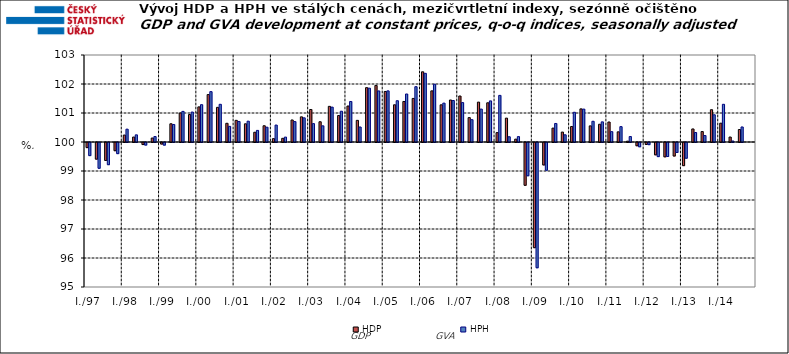
| Category | HDP

 | HPH

 |
|---|---|---|
| I./97 | 99.824 | 99.548 |
|  | 99.426 | 99.111 |
|  | 99.381 | 99.235 |
|  | 99.717 | 99.616 |
| I./98 | 100.239 | 100.443 |
|  | 100.171 | 100.246 |
|  | 99.929 | 99.911 |
|  | 100.137 | 100.188 |
| I./99 | 99.947 | 99.91 |
|  | 100.628 | 100.604 |
|  | 100.999 | 101.055 |
|  | 100.948 | 101.033 |
| I./00 | 101.211 | 101.287 |
|  | 101.635 | 101.737 |
|  | 101.195 | 101.3 |
|  | 100.645 | 100.54 |
| I./01 | 100.746 | 100.708 |
|  | 100.628 | 100.718 |
|  | 100.336 | 100.4 |
|  | 100.56 | 100.51 |
| I./02 | 100.116 | 100.584 |
|  | 100.127 | 100.169 |
|  | 100.76 | 100.704 |
|  | 100.867 | 100.833 |
| I./03 | 101.121 | 100.633 |
|  | 100.698 | 100.558 |
|  | 101.229 | 101.203 |
|  | 100.913 | 101.061 |
| I./04 | 101.241 | 101.397 |
|  | 100.747 | 100.518 |
|  | 101.874 | 101.856 |
|  | 101.951 | 101.761 |
| I./05 | 101.743 | 101.763 |
|  | 101.283 | 101.424 |
|  | 101.397 | 101.656 |
|  | 101.502 | 101.907 |
| I./06 | 102.421 | 102.368 |
|  | 101.763 | 101.992 |
|  | 101.282 | 101.34 |
|  | 101.448 | 101.431 |
| I./07 | 101.586 | 101.359 |
|  | 100.841 | 100.77 |
|  | 101.375 | 101.135 |
|  | 101.352 | 101.417 |
| I./08 | 100.323 | 101.608 |
|  | 100.823 | 100.181 |
|  | 100.099 | 100.185 |
|  | 98.525 | 98.853 |
| I./09 | 96.373 | 95.68 |
|  | 99.226 | 99.043 |
|  | 100.479 | 100.639 |
|  | 100.343 | 100.248 |
| I./10 | 100.535 | 101.025 |
|  | 101.142 | 101.135 |
|  | 100.556 | 100.715 |
|  | 100.612 | 100.694 |
| I./11 | 100.69 | 100.357 |
|  | 100.351 | 100.53 |
|  | 100.029 | 100.188 |
|  | 99.888 | 99.853 |
| I./12 | 99.932 | 99.926 |
|  | 99.574 | 99.513 |
|  | 99.506 | 99.516 |
|  | 99.534 | 99.656 |
| I./13 | 99.202 | 99.458 |
|  | 100.45 | 100.327 |
|  | 100.36 | 100.223 |
|  | 101.113 | 100.939 |
| I./14 | 100.649 | 101.3 |